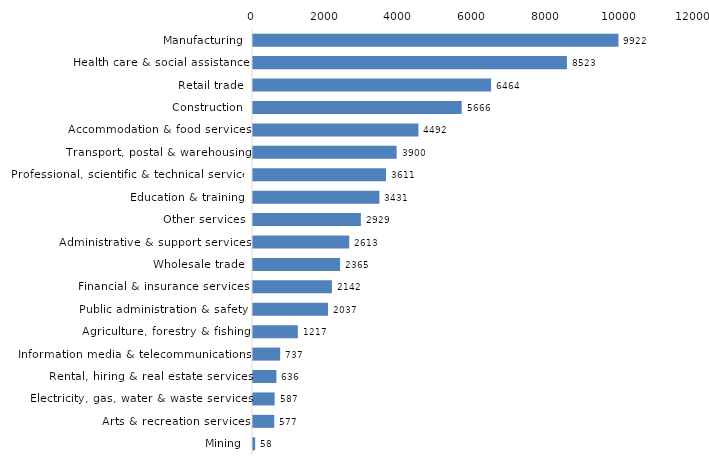
| Category | Series 0 |
|---|---|
| Manufacturing | 9922 |
| Health care & social assistance | 8523 |
| Retail trade | 6464 |
| Construction | 5666 |
| Accommodation & food services | 4492 |
| Transport, postal & warehousing | 3900 |
| Professional, scientific & technical services | 3611 |
| Education & training | 3431 |
| Other services | 2929 |
| Administrative & support services | 2613 |
| Wholesale trade | 2365 |
| Financial & insurance services | 2142 |
| Public administration & safety | 2037 |
| Agriculture, forestry & fishing | 1217 |
| Information media & telecommunications | 737 |
| Rental, hiring & real estate services | 636 |
| Electricity, gas, water & waste services | 587 |
| Arts & recreation services | 577 |
| Mining | 58 |